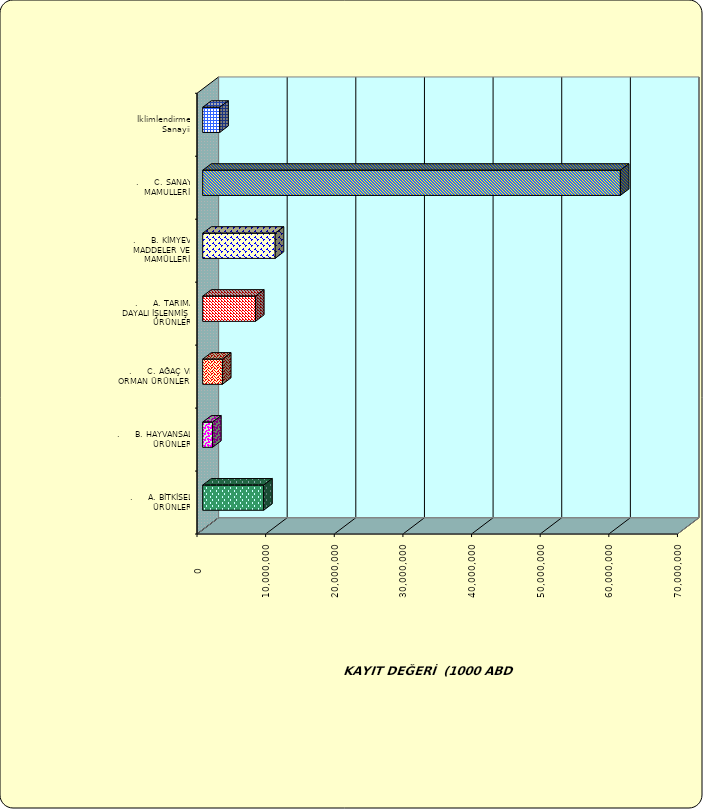
| Category | Series 0 |
|---|---|
| .     A. BİTKİSEL ÜRÜNLER | 8885876.745 |
| .     B. HAYVANSAL ÜRÜNLER | 1442955.947 |
| .     C. AĞAÇ VE ORMAN ÜRÜNLERİ | 2876392.564 |
| .     A. TARIMA DAYALI İŞLENMİŞ ÜRÜNLER | 7693021.279 |
| .     B. KİMYEVİ MADDELER VE MAMÜLLERİ | 10561831.334 |
| .     C. SANAYİ MAMULLERİ | 60855520.267 |
|  İklimlendirme Sanayii | 2484455.219 |